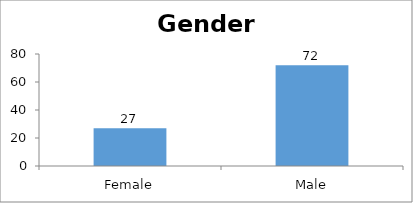
| Category | Gender |
|---|---|
| Female | 27 |
| Male | 72 |